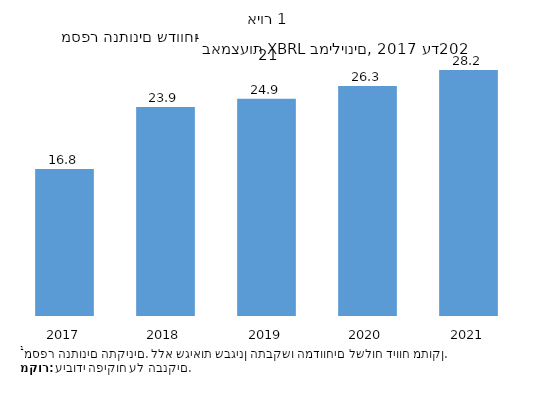
| Category | Series 0 |
|---|---|
| 2017.0 | 16.843 |
| 2018.0 | 23.94 |
| 2019.0 | 24.89 |
| 2020.0 | 26.348 |
| 2021.0 | 28.16 |